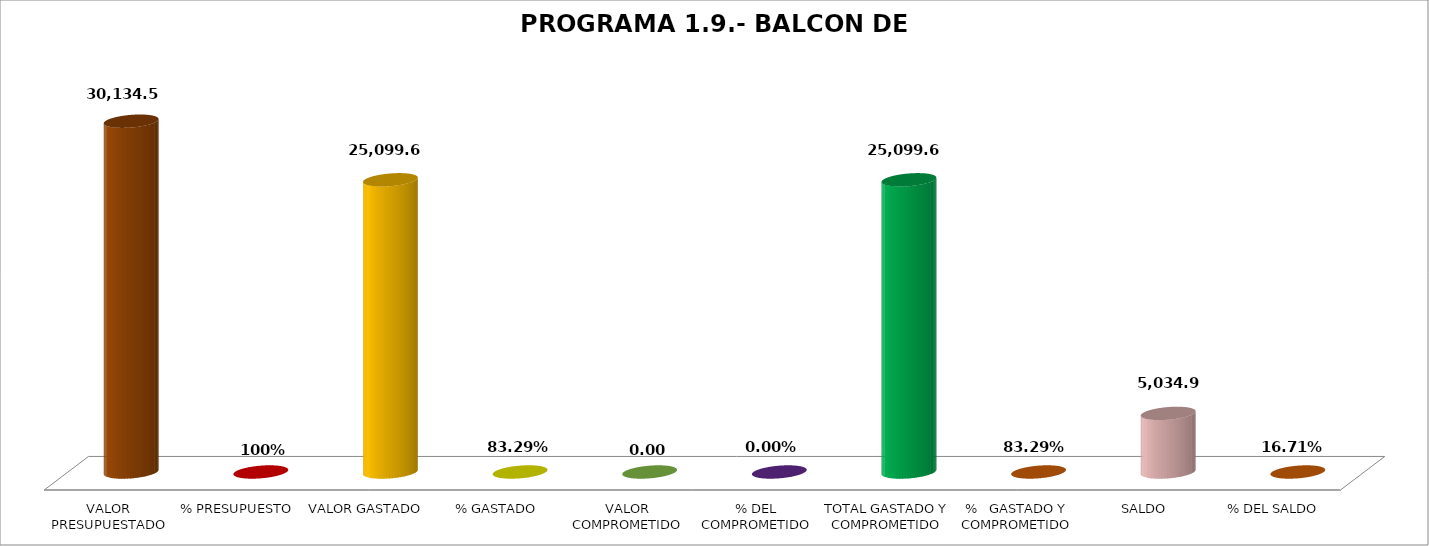
| Category | PROGRAMA 1.9.- BALCON DE SERVICIOS |
|---|---|
| VALOR PRESUPUESTADO | 30134.58 |
| % PRESUPUESTO | 1 |
| VALOR GASTADO | 25099.68 |
| % GASTADO | 0.833 |
| VALOR COMPROMETIDO | 0 |
| % DEL COMPROMETIDO | 0 |
| TOTAL GASTADO Y COMPROMETIDO | 25099.68 |
| %   GASTADO Y COMPROMETIDO | 0.833 |
| SALDO | 5034.9 |
| % DEL SALDO | 0.167 |